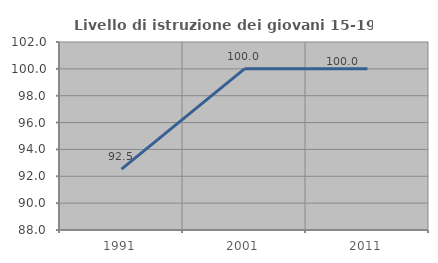
| Category | Livello di istruzione dei giovani 15-19 anni |
|---|---|
| 1991.0 | 92.537 |
| 2001.0 | 100 |
| 2011.0 | 100 |